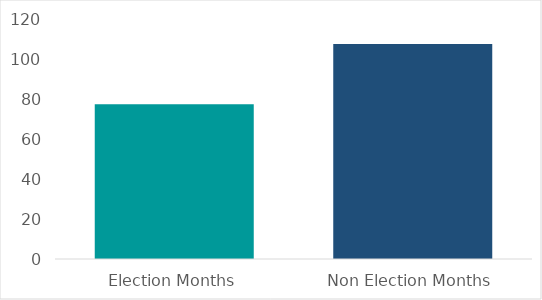
| Category | Average Amont per Month |
|---|---|
| Election Months | 77.421 |
| Non Election Months | 107.494 |